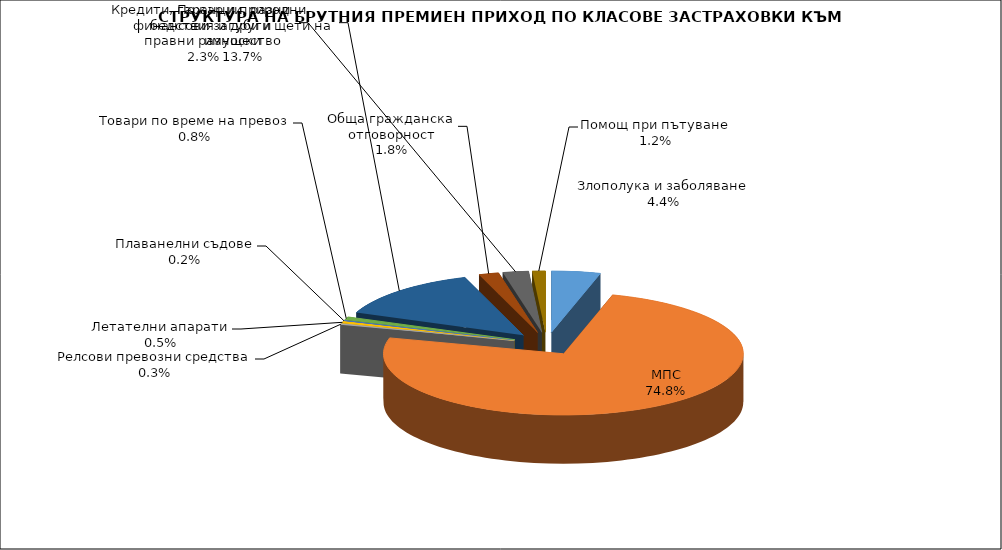
| Category | Злополука и заболяване |
|---|---|
| Злополука и заболяване | 0.044 |
| МПС | 0.748 |
| Релсови превозни средства | 0.003 |
| Летателни апарати | 0.005 |
| Плаванелни съдове | 0.002 |
| Товари по време на превоз | 0.008 |
| Пожар и природни бедствия и други щети на имущество | 0.137 |
| Обща гражданска отговорност | 0.018 |
| Кредити, гаранции, разни финансови загуби и правни разноски | 0.023 |
| Помощ при пътуване | 0.012 |